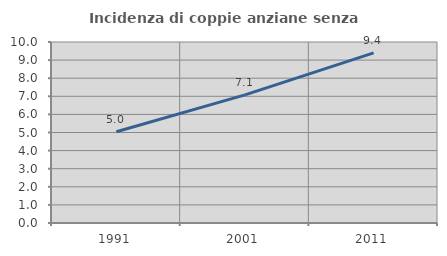
| Category | Incidenza di coppie anziane senza figli  |
|---|---|
| 1991.0 | 5.044 |
| 2001.0 | 7.077 |
| 2011.0 | 9.397 |